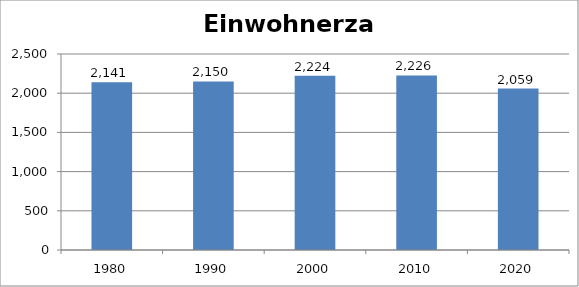
| Category | Einwohnerzahl |
|---|---|
| 1980.0 | 2141 |
| 1990.0 | 2150 |
| 2000.0 | 2224 |
| 2010.0 | 2226 |
| 2020.0 | 2059 |